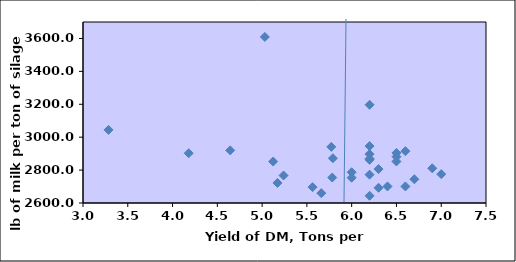
| Category | Series 0 |
|---|---|
| 6.3 | 2806 |
| 6.5 | 2852.5 |
| 6.0 | 2753.75 |
| 6.2 | 2869.25 |
| 6.5 | 2904.25 |
| 6.3 | 2692.5 |
| 5.23910527 | 2767.25 |
| 5.03051096 | 3609.3 |
| 5.56357973 | 2696.25 |
| 6.2 | 3197 |
| 5.78303071 | 2754.75 |
| 6.4 | 2700.5 |
| 6.2 | 2643.75 |
| 5.17180203 | 2722 |
| 5.79047622 | 2872 |
| 6.2 | 2862.5 |
| 6.2 | 2772.25 |
| 6.5 | 2881.5 |
| 6.9 | 2811 |
| 4.64350223 | 2920 |
| 6.0 | 2787 |
| 5.7726136 | 2941 |
| 5.66100187 | 2659.75 |
| 6.7 | 2744.25 |
| 6.2 | 2897 |
| 5.12381009 | 2852 |
| 3.2854228 | 3044.333 |
| 4.18035854 | 2902.5 |
| 6.6 | 2915 |
| 6.6 | 2700.75 |
| 6.2 | 2946 |
| 7.0 | 2775.333 |